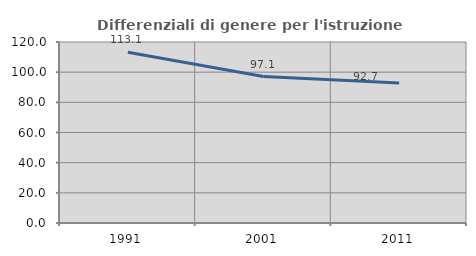
| Category | Differenziali di genere per l'istruzione superiore |
|---|---|
| 1991.0 | 113.143 |
| 2001.0 | 97.063 |
| 2011.0 | 92.739 |